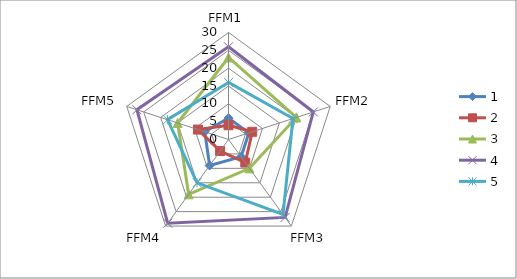
| Category | 1 | 2 | 3 | 4 | 5 |
|---|---|---|---|---|---|
| FFM1 | 6 | 4 | 23 | 26 | 16 |
| FFM2 | 6 | 7 | 20 | 25 | 19 |
| FFM3 | 6 | 8 | 10 | 27 | 26 |
| FFM4 | 9 | 4 | 19 | 29 | 15 |
| FFM5 | 7 | 9 | 15 | 27 | 18 |